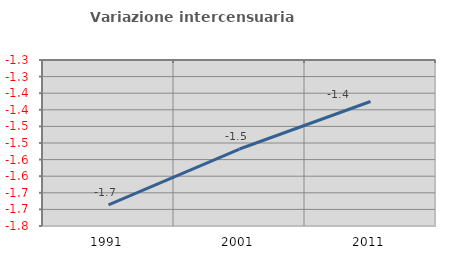
| Category | Variazione intercensuaria annua |
|---|---|
| 1991.0 | -1.686 |
| 2001.0 | -1.518 |
| 2011.0 | -1.375 |